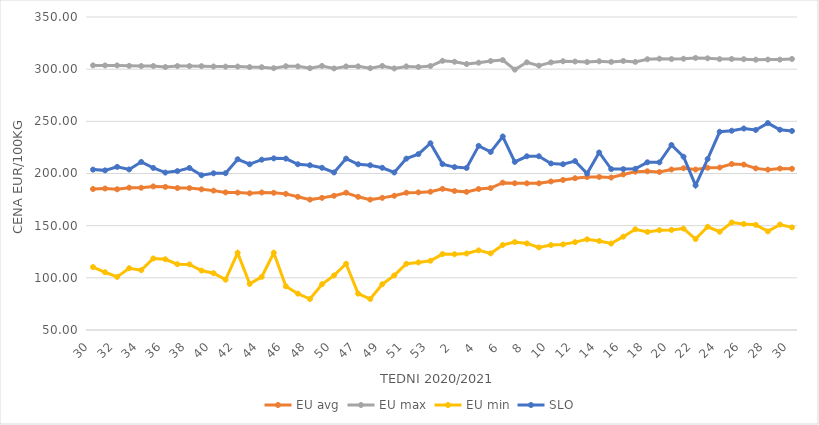
| Category | EU avg | EU max | EU min | SLO |
|---|---|---|---|---|
| 30.0 | 185.141 | 303.63 | 110.314 | 203.73 |
| 31.0 | 185.621 | 303.57 | 105.336 | 203 |
| 32.0 | 184.887 | 303.58 | 100.908 | 206.36 |
| 33.0 | 186.411 | 303.17 | 109.191 | 203.88 |
| 34.0 | 186.338 | 302.96 | 107.355 | 211.07 |
| 35.0 | 187.628 | 302.99 | 118.534 | 205.34 |
| 36.0 | 187.19 | 302.05 | 117.814 | 200.88 |
| 37.0 | 186.038 | 302.98 | 113.058 | 202.29 |
| 38.0 | 185.986 | 302.94 | 112.896 | 205.33 |
| 39.0 | 184.836 | 302.88 | 106.953 | 198.33 |
| 40.0 | 183.595 | 302.56 | 104.426 | 200.21 |
| 41.0 | 181.893 | 302.44 | 98.23 | 200.3 |
| 42.0 | 181.671 | 302.52 | 123.908 | 213.66 |
| 43.0 | 181.023 | 302.01 | 94.177 | 208.86 |
| 44.0 | 181.795 | 301.86 | 100.908 | 213.25 |
| 45.0 | 181.489 | 300.98 | 124 | 214.51 |
| 46.0 | 180.473 | 302.82 | 91.889 | 214.27 |
| 47.0 | 177.656 | 302.7 | 84.832 | 208.87 |
| 48.0 | 174.977 | 300.94 | 79.697 | 207.9 |
| 49.0 | 176.65 | 303.09 | 93.873 | 205.48 |
| 50.0 | 178.648 | 300.7 | 102.316 | 200.99 |
| 51.0 | 181.58 | 302.62 | 113.46 | 214.25 |
| 47.0 | 177.656 | 302.7 | 84.832 | 208.87 |
| 48.0 | 174.977 | 300.94 | 79.697 | 207.9 |
| 49.0 | 176.65 | 303.09 | 93.873 | 205.48 |
| 50.0 | 178.648 | 300.7 | 102.316 | 200.99 |
| 51.0 | 181.58 | 302.62 | 113.46 | 214.25 |
| 52.0 | 181.9 | 302.14 | 114.76 | 218.61 |
| 53.0 | 182.536 | 303 | 116.375 | 229 |
| 1.0 | 185.3 | 308 | 122.769 | 209 |
| 2.0 | 183.25 | 307.1 | 122.609 | 206.15 |
| 3.0 | 182.393 | 304.91 | 123.32 | 205.35 |
| 4.0 | 185.158 | 306.22 | 126.329 | 226.48 |
| 5.0 | 186.04 | 307.79 | 123.461 | 220.65 |
| 6.0 | 191.206 | 308.7 | 131.528 | 235.46 |
| 7.0 | 190.629 | 299.55 | 134.262 | 211.1 |
| 8.0 | 190.57 | 306.55 | 132.97 | 216.51 |
| 9.0 | 190.562 | 303.4 | 129.173 | 216.54 |
| 10.0 | 192.373 | 306.48 | 131.374 | 209.61 |
| 11.0 | 193.79 | 307.58 | 132.024 | 208.91 |
| 12.0 | 195.449 | 307.33 | 134.212 | 211.87 |
| 13.0 | 196.631 | 306.85 | 136.936 | 199.93 |
| 14.0 | 196.702 | 307.56 | 135.297 | 220.15 |
| 15.0 | 196.13 | 306.96 | 132.893 | 204.2 |
| 16.0 | 199.1 | 307.87 | 139.462 | 204.2 |
| 17.0 | 201.754 | 306.98 | 146.538 | 204.51 |
| 18.0 | 202.13 | 309.49 | 144.017 | 210.72 |
| 19.0 | 201.439 | 310.06 | 145.644 | 210.68 |
| 20.0 | 203.834 | 309.69 | 145.911 | 227.32 |
| 21.0 | 205.04 | 309.99 | 147.188 | 216.08 |
| 22.0 | 203.79 | 310.76 | 137.177 | 188.6 |
| 23.0 | 205.51 | 310.41 | 148.928 | 213.84 |
| 24.0 | 205.73 | 309.64 | 144.161 | 239.99 |
| 25.0 | 209.095 | 309.74 | 153.081 | 240.99 |
| 26.0 | 208.551 | 309.55 | 151.599 | 243.11 |
| 27.0 | 204.914 | 309.08 | 150.789 | 241.72 |
| 28.0 | 203.681 | 309.21 | 144.56 | 248.33 |
| 29.0 | 204.773 | 309.15 | 151.052 | 241.96 |
| 30.0 | 204.533 | 309.78 | 148.33 | 240.79 |